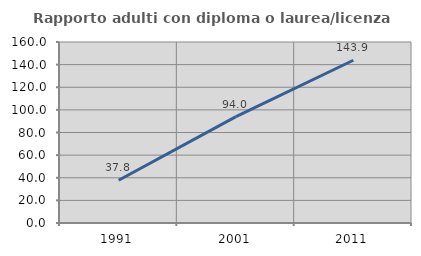
| Category | Rapporto adulti con diploma o laurea/licenza media  |
|---|---|
| 1991.0 | 37.778 |
| 2001.0 | 94.022 |
| 2011.0 | 143.86 |